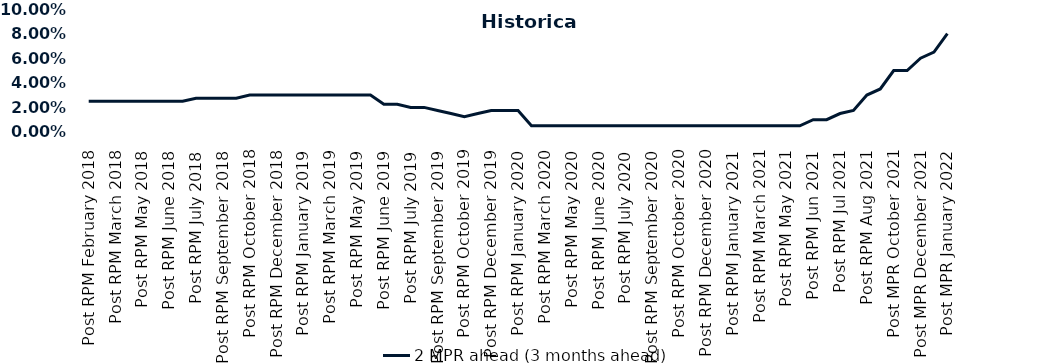
| Category | 2 MPR ahead (3 months ahead) |
|---|---|
| Post RPM February 2018 | 0.025 |
| Pre RPM March 2018 | 0.025 |
| Post RPM March 2018 | 0.025 |
| Pre RPM May 2018 | 0.025 |
| Post RPM May 2018 | 0.025 |
| Pre RPM June 2018 | 0.025 |
| Post RPM June 2018 | 0.025 |
| Pre RPM July 2018 | 0.025 |
| Post RPM July 2018 | 0.028 |
| Pre RPM September 2018 | 0.028 |
| Post RPM September 2018 | 0.028 |
| Pre RPM October 2018 | 0.028 |
| Post RPM October 2018 | 0.03 |
| Pre RPM December 2018 | 0.03 |
| Post RPM December 2018 | 0.03 |
| Pre RPM January 2019 | 0.03 |
| Post RPM January 2019 | 0.03 |
| Pre RPM March 2019 | 0.03 |
| Post RPM March 2019 | 0.03 |
| Pre RPM May 2019 | 0.03 |
| Post RPM May 2019 | 0.03 |
| Pre RPM June 2019 | 0.03 |
| Post RPM June 2019 | 0.022 |
| Pre RPM July 2019 | 0.022 |
| Post RPM July 2019 | 0.02 |
| Pre RPM September 2019 | 0.02 |
| Post RPM September 2019 | 0.018 |
| Pre RPM October 2019 | 0.015 |
| Post RPM October 2019 | 0.012 |
| Pre RPM December 2019 | 0.015 |
| Post RPM December 2019 | 0.018 |
| Pre RPM January 2020 | 0.018 |
| Post RPM January 2020 | 0.018 |
| Pre RPM March 2020 | 0.005 |
| Post RPM March 2020 | 0.005 |
| Pre RPM May 2020 | 0.005 |
| Post RPM May 2020 | 0.005 |
| Pre RPM June 2020 | 0.005 |
| Post RPM June 2020 | 0.005 |
| Pre RPM July 2020 | 0.005 |
| Post RPM July 2020 | 0.005 |
| Pre RPM September 2020 | 0.005 |
| Post RPM September 2020 | 0.005 |
| Pre RPM October 2020 | 0.005 |
| Post RPM October 2020 | 0.005 |
| Pre RPM December 2020 | 0.005 |
|  Post RPM December 2020 | 0.005 |
| Pre RPM January 2021 | 0.005 |
| Post RPM January 2021 | 0.005 |
|  Pre RPM March 2021 | 0.005 |
|  Post RPM March 2021 | 0.005 |
|  Pre RPM May 2021 | 0.005 |
|  Post RPM May 2021 | 0.005 |
|  Pre RPM Jun 2021 | 0.005 |
|   Post RPM Jun 2021 | 0.01 |
| Pre RPM Jul 2021 | 0.01 |
|  Post RPM Jul 2021 | 0.015 |
| Pre RPM Aug 2021 | 0.018 |
|  Post RPM Aug 2021 | 0.03 |
| Pre MPR October 2021 | 0.035 |
| Post MPR October 2021 | 0.05 |
| Pre MPR December 2021 | 0.05 |
| Post MPR December 2021 | 0.06 |
| Pre MPR January 2022 | 0.065 |
| Post MPR January 2022 | 0.08 |